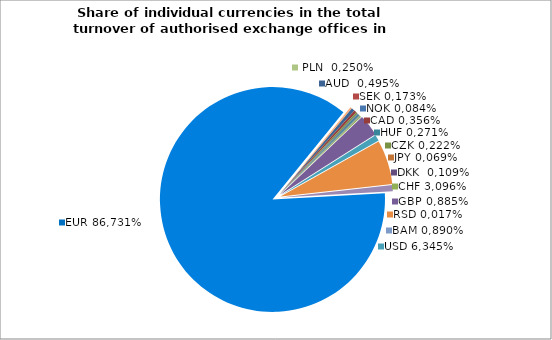
| Category | AUD |
|---|---|
| 0.0049543464752985125 | 0.005 |
| 0.0035566609784555697 | 0.004 |
| 0.002221494895561068 | 0.002 |
| 0.0010894015201197028 | 0.001 |
| 0.0027093178972211252 | 0.003 |
| 0.0006850344497298138 | 0.001 |
| 0.0008424427069043314 | 0.001 |
| 2.8955236224711904e-05 | 0 |
| 0.0017273784321258333 | 0.002 |
| 0.03096169715020614 | 0.031 |
| 0.008853635916452276 | 0.009 |
| 0.06344955599206195 | 0.063 |
| 0.000173200111857724 | 0 |
| 2.302628129079646e-05 | 0 |
| 1.630758920111951e-05 | 0 |
| 0.008901119215696347 | 0.009 |
| 0.8673084240780269 | 0.867 |
| 0.00249800107356604 | 0.002 |